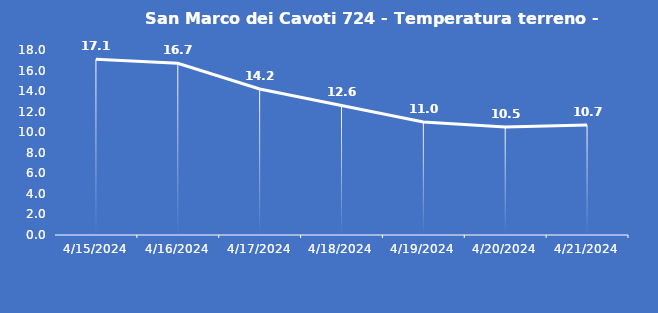
| Category | San Marco dei Cavoti 724 - Temperatura terreno - Grezzo (°C) |
|---|---|
| 4/15/24 | 17.1 |
| 4/16/24 | 16.7 |
| 4/17/24 | 14.2 |
| 4/18/24 | 12.6 |
| 4/19/24 | 11 |
| 4/20/24 | 10.5 |
| 4/21/24 | 10.7 |